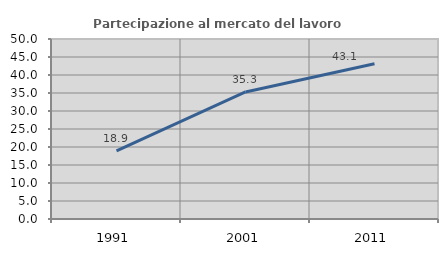
| Category | Partecipazione al mercato del lavoro  femminile |
|---|---|
| 1991.0 | 18.919 |
| 2001.0 | 35.294 |
| 2011.0 | 43.103 |